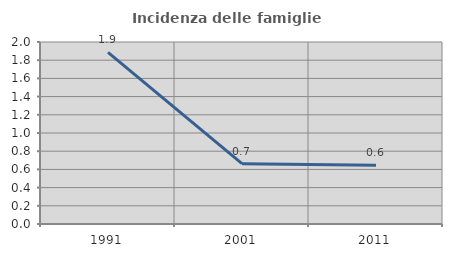
| Category | Incidenza delle famiglie numerose |
|---|---|
| 1991.0 | 1.887 |
| 2001.0 | 0.663 |
| 2011.0 | 0.646 |